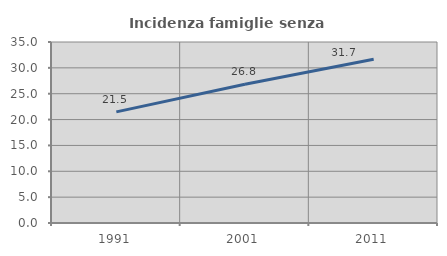
| Category | Incidenza famiglie senza nuclei |
|---|---|
| 1991.0 | 21.488 |
| 2001.0 | 26.819 |
| 2011.0 | 31.673 |